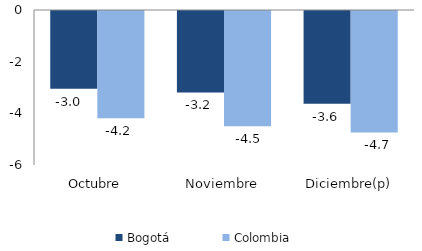
| Category | Bogotá | Colombia |
|---|---|---|
| Octubre | -3.01 | -4.156 |
| Noviembre | -3.151 | -4.462 |
| Diciembre(p) | -3.588 | -4.7 |